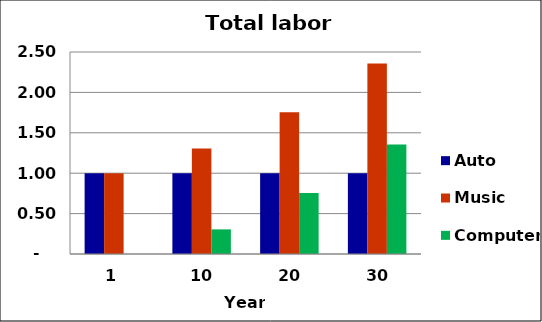
| Category | Auto | Music | Computer |
|---|---|---|---|
| 1.0 | 1 | 1 | 0 |
| 10.0 | 1 | 1.305 | 0.305 |
| 20.0 | 1 | 1.754 | 0.754 |
| 30.0 | 1 | 2.357 | 1.357 |